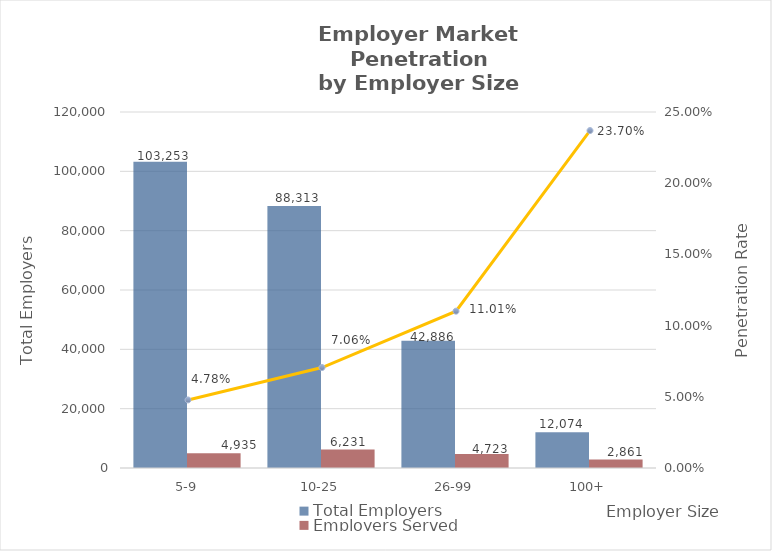
| Category | Total Employers | Employers Served |
|---|---|---|
| 5-9 | 103253 | 4935 |
| 10-25 | 88313 | 6231 |
| 26-99 | 42886 | 4723 |
| 100+ | 12074 | 2861 |